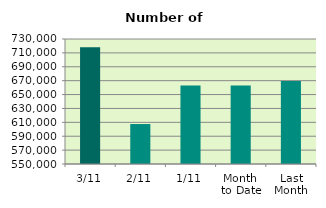
| Category | Series 0 |
|---|---|
| 3/11 | 718078 |
| 2/11 | 607560 |
| 1/11 | 662974 |
| Month 
to Date | 662870.667 |
| Last
Month | 669366.857 |